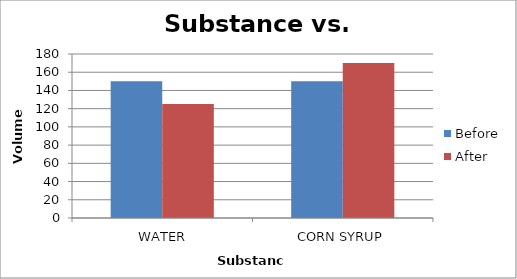
| Category | Before | After |
|---|---|---|
|  WATER | 150 | 125 |
| CORN SYRUP | 150 | 170 |